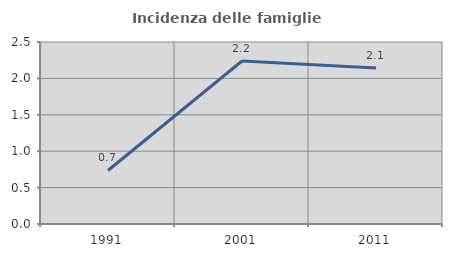
| Category | Incidenza delle famiglie numerose |
|---|---|
| 1991.0 | 0.735 |
| 2001.0 | 2.239 |
| 2011.0 | 2.143 |